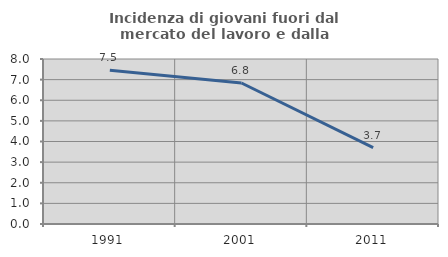
| Category | Incidenza di giovani fuori dal mercato del lavoro e dalla formazione  |
|---|---|
| 1991.0 | 7.453 |
| 2001.0 | 6.838 |
| 2011.0 | 3.704 |